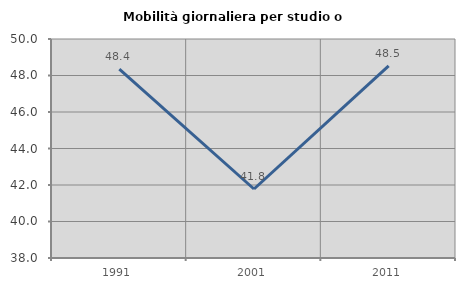
| Category | Mobilità giornaliera per studio o lavoro |
|---|---|
| 1991.0 | 48.354 |
| 2001.0 | 41.781 |
| 2011.0 | 48.533 |